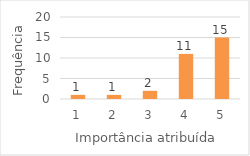
| Category | Series 0 |
|---|---|
| 1.0 | 1 |
| 2.0 | 1 |
| 3.0 | 2 |
| 4.0 | 11 |
| 5.0 | 15 |